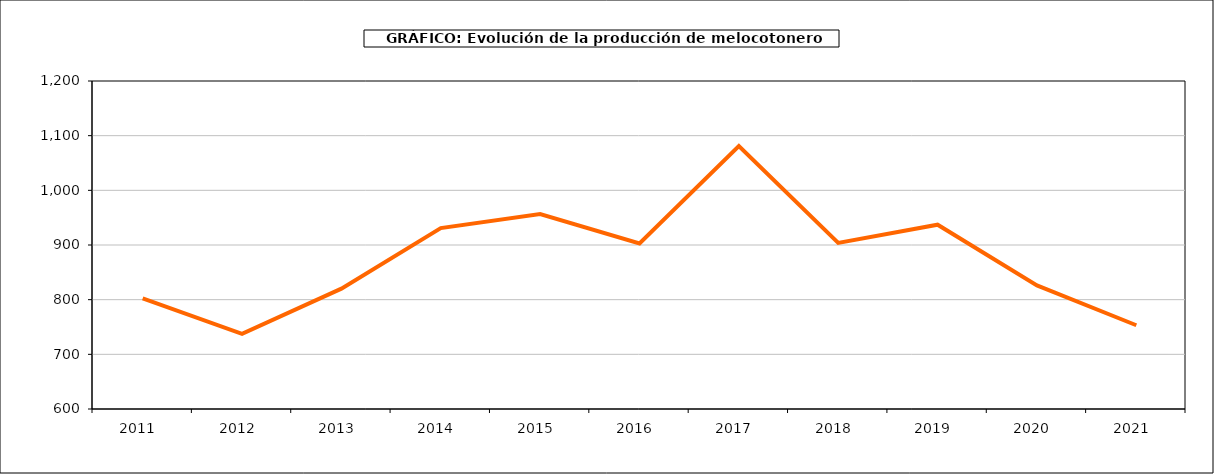
| Category | producción melocotonero |
|---|---|
| 2011.0 | 802.391 |
| 2012.0 | 737.531 |
| 2013.0 | 820.139 |
| 2014.0 | 930.862 |
| 2015.0 | 956.688 |
| 2016.0 | 902.884 |
| 2017.0 | 1081.157 |
| 2018.0 | 903.809 |
| 2019.0 | 937.166 |
| 2020.0 | 825.954 |
| 2021.0 | 753.205 |